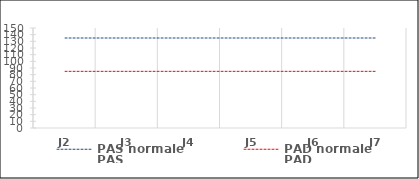
| Category | PAS normale | PAD normale | PAS | PAD |
|---|---|---|---|---|
| J2 | 135 | 85 | 0 | 0 |
| J3 | 135 | 85 | 0 | 0 |
| J4 | 135 | 85 | 0 | 0 |
| J5 | 135 | 85 | 0 | 0 |
| J6 | 135 | 85 | 0 | 0 |
| J7 | 135 | 85 | 0 | 0 |